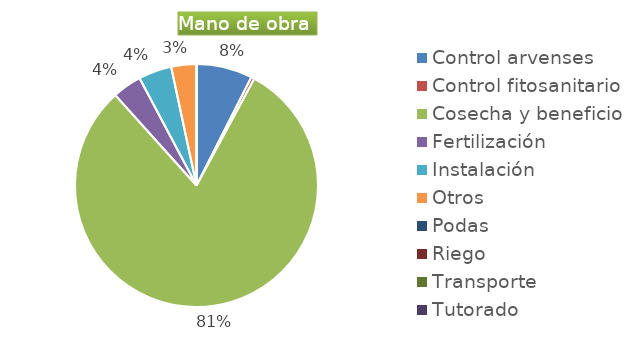
| Category | Series 0 |
|---|---|
| Control arvenses | 3771601 |
| Control fitosanitario | 218888 |
| Cosecha y beneficio | 40709570 |
| Fertilización | 1969992 |
| Instalación | 2232657 |
| Otros | 1696382 |
| Podas | 0 |
| Riego | 0 |
| Transporte | 0 |
| Tutorado | 0 |